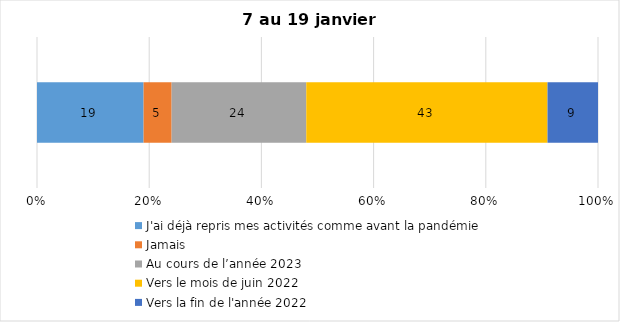
| Category | J'ai déjà repris mes activités comme avant la pandémie | Jamais | Au cours de l’année 2023 | Vers le mois de juin 2022 | Vers la fin de l'année 2022 |
|---|---|---|---|---|---|
| 0 | 19 | 5 | 24 | 43 | 9 |